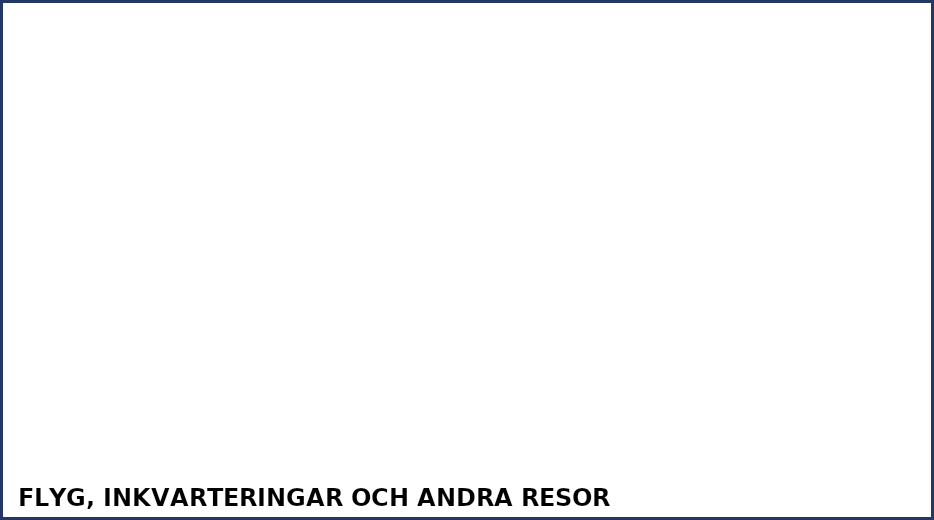
| Category | Liikematkat |
|---|---|
| Flyg: inrikes | 0 |
| Flygresor: utrikes | 0 |
| Resor med bil som berättigar till km-ersättning | 0 |
| Tjänsteresor med tåg | 0 |
| Tjänsteresor med buss | 0 |
| Antal övernattningar på hotell | 0 |
| Taxiresor | 0 |
| Båtresor | 0 |